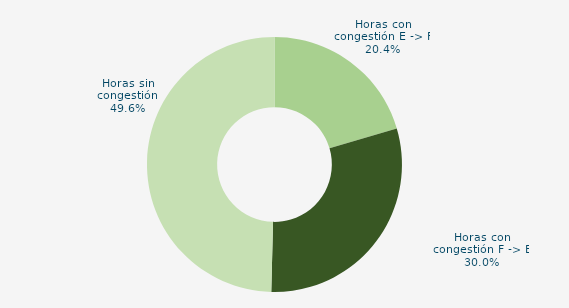
| Category | Horas con congestión E -> F |
|---|---|
| Horas con congestión E -> F | 20.43 |
| Horas con congestión F -> E | 29.973 |
| Horas sin congestión | 49.597 |